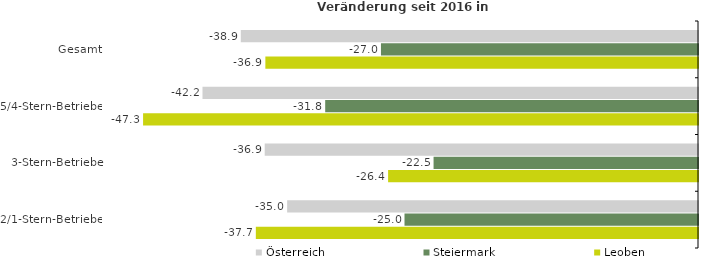
| Category | Österreich | Steiermark | Leoben |
|---|---|---|---|
| Gesamt | -38.943 | -27.005 | -36.851 |
| 5/4-Stern-Betriebe | -42.206 | -31.755 | -47.268 |
| 3-Stern-Betriebe | -36.907 | -22.524 | -26.397 |
| 2/1-Stern-Betriebe | -34.996 | -25 | -37.663 |